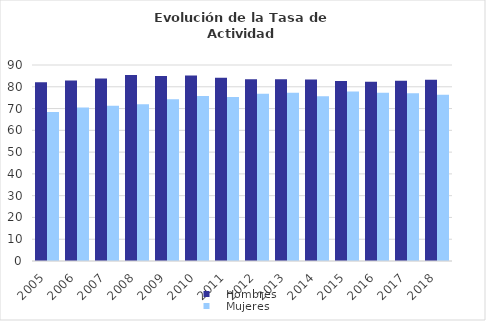
| Category |    Hombres |    Mujeres |
|---|---|---|
| 2005.0 | 82.06 | 68.401 |
| 2006.0 | 82.863 | 70.507 |
| 2007.0 | 83.792 | 71.238 |
| 2008.0 | 85.428 | 71.928 |
| 2009.0 | 84.95 | 74.256 |
| 2010.0 | 85.188 | 75.748 |
| 2011.0 | 84.171 | 75.314 |
| 2012.0 | 83.444 | 76.775 |
| 2013.0 | 83.442 | 77.238 |
| 2014.0 | 83.379 | 75.652 |
| 2015.0 | 82.685 | 77.779 |
| 2016.0 | 82.351 | 77.217 |
| 2017.0 | 82.727 | 77 |
| 2018.0 | 83.263 | 76.377 |